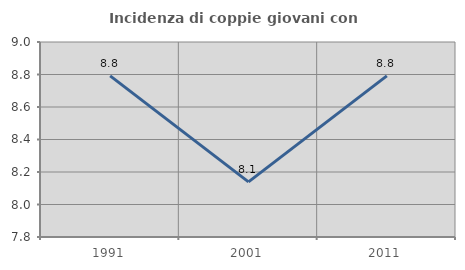
| Category | Incidenza di coppie giovani con figli |
|---|---|
| 1991.0 | 8.791 |
| 2001.0 | 8.14 |
| 2011.0 | 8.791 |